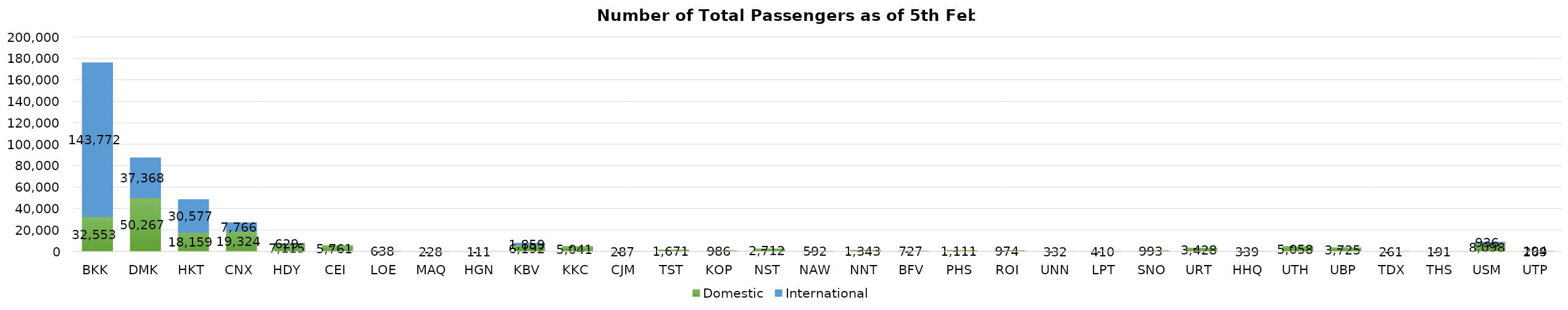
| Category | Domestic | International |
|---|---|---|
| BKK | 32553 | 143772 |
| DMK | 50267 | 37368 |
| HKT | 18159 | 30577 |
| CNX | 19324 | 7766 |
| HDY | 7115 | 629 |
| CEI | 5761 | 0 |
| LOE | 638 | 0 |
| MAQ | 228 | 0 |
| HGN | 111 | 0 |
| KBV | 6192 | 1859 |
| KKC | 5041 | 0 |
| CJM | 287 | 0 |
| TST | 1671 | 0 |
| KOP | 986 | 0 |
| NST | 2712 | 0 |
| NAW | 592 | 0 |
| NNT | 1343 | 0 |
| BFV | 727 | 0 |
| PHS | 1111 | 0 |
| ROI | 974 | 0 |
| UNN | 332 | 0 |
| LPT | 410 | 0 |
| SNO | 993 | 0 |
| URT | 3428 | 0 |
| HHQ | 339 | 0 |
| UTH | 5058 | 0 |
| UBP | 3725 | 0 |
| TDX | 261 | 0 |
| THS | 191 | 0 |
| USM | 8098 | 936 |
| UTP | 269 | 194 |